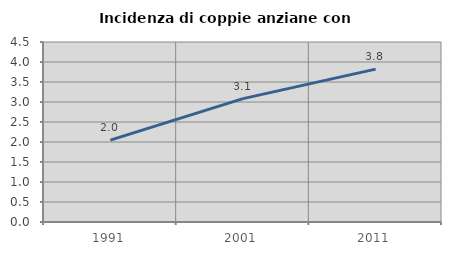
| Category | Incidenza di coppie anziane con figli |
|---|---|
| 1991.0 | 2.047 |
| 2001.0 | 3.084 |
| 2011.0 | 3.821 |